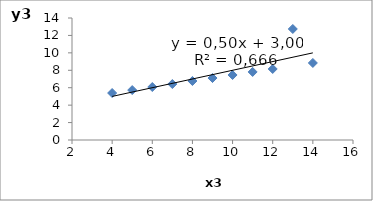
| Category | y3 |
|---|---|
| 10.0 | 7.46 |
| 8.0 | 6.77 |
| 13.0 | 12.74 |
| 9.0 | 7.11 |
| 11.0 | 7.81 |
| 14.0 | 8.84 |
| 6.0 | 6.08 |
| 4.0 | 5.39 |
| 12.0 | 8.15 |
| 7.0 | 6.42 |
| 5.0 | 5.73 |